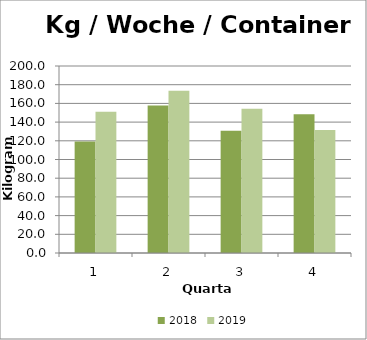
| Category | 2018 | 2019 |
|---|---|---|
| 0 | 119.231 | 151.154 |
| 1 | 157.692 | 173.462 |
| 2 | 130.769 | 154.231 |
| 3 | 148.462 | 131.538 |